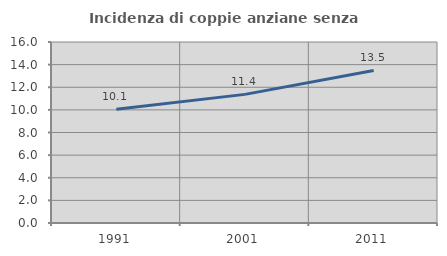
| Category | Incidenza di coppie anziane senza figli  |
|---|---|
| 1991.0 | 10.058 |
| 2001.0 | 11.37 |
| 2011.0 | 13.481 |